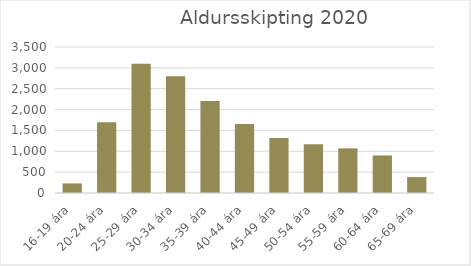
| Category | Series 0 |
|---|---|
| 16-19 ára | 230.167 |
| 20-24 ára | 1693.083 |
| 25-29 ára | 3097.833 |
| 30-34 ára | 2801.667 |
| 35-39 ára | 2208.167 |
| 40-44 ára | 1652.5 |
| 45-49 ára | 1319.833 |
| 50-54 ára | 1167.75 |
| 55-59 ára | 1069.667 |
| 60-64 ára | 900 |
| 65-69 ára | 381.833 |